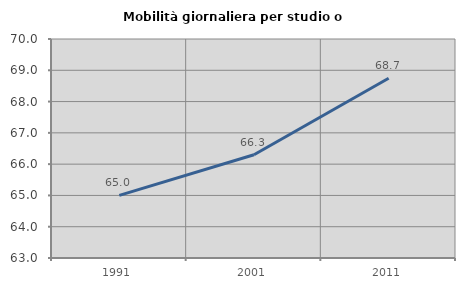
| Category | Mobilità giornaliera per studio o lavoro |
|---|---|
| 1991.0 | 65 |
| 2001.0 | 66.301 |
| 2011.0 | 68.746 |